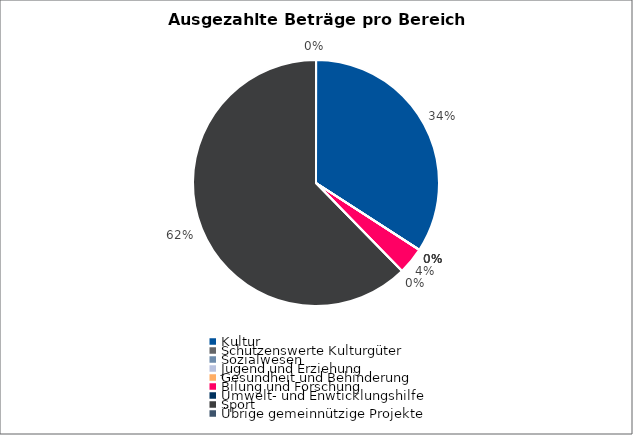
| Category | Series 0 |
|---|---|
| Kultur | 241524 |
| Schützenswerte Kulturgüter | 0 |
| Sozialwesen | 0 |
| Jugend und Erziehung | 0 |
| Gesundheit und Behinderung | 0 |
| Bilung und Forschung | 25000 |
| Umwelt- und Enwticklungshilfe | 0 |
| Sport | 441110 |
| Übrige gemeinnützige Projekte | 0 |